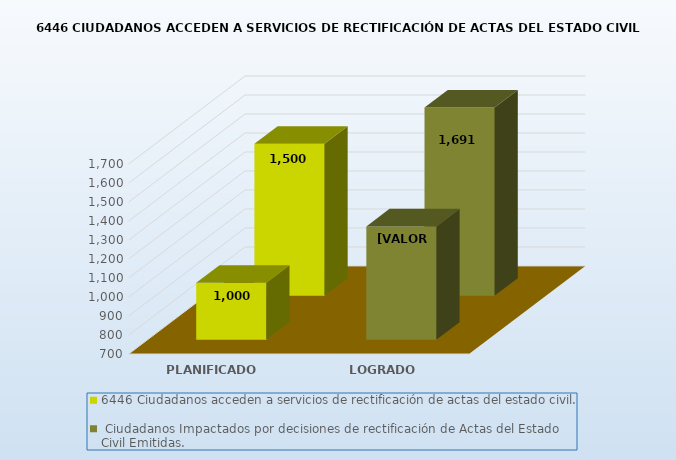
| Category | 6446 |
|---|---|
| PLANIFICADO | 1500 |
| LOGRADO | 1691 |